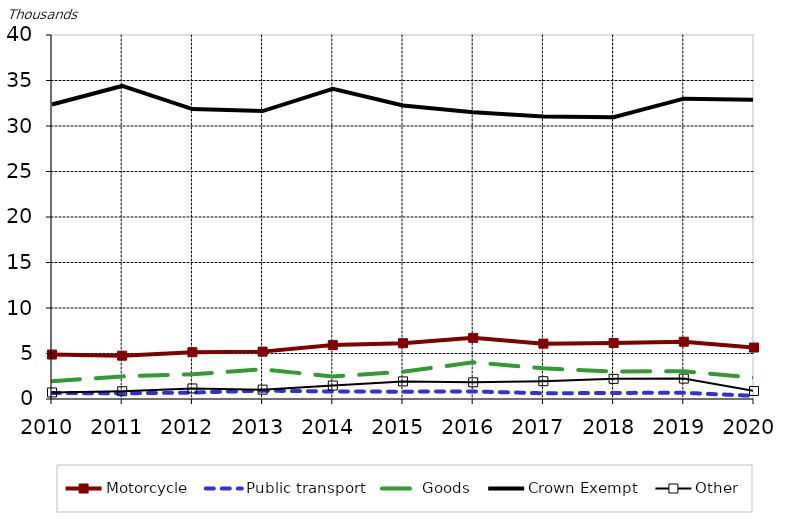
| Category | Motorcycle | Public transport | Goods | Crown Exempt | Other | Crown revised | Other revised |
|---|---|---|---|---|---|---|---|
| 2010 | 4.886 | 0.654 | 1.962 |  |  | 32.357 | 0.72 |
| 2011 | 4.758 | 0.628 | 2.485 |  |  | 34.4 | 0.856 |
| 2012 | 5.139 | 0.704 | 2.72 |  |  | 31.861 | 1.16 |
| 2013 | 5.206 | 0.916 | 3.263 |  |  | 31.64 | 1.027 |
| 2014 | 5.922 | 0.824 | 2.464 |  |  | 34.078 | 1.476 |
| 2015 | 6.13 | 0.806 | 3 |  |  | 32.258 | 1.934 |
| 2016 | 6.721 | 0.83 | 4.025 |  |  | 31.509 | 1.836 |
| 2017 | 6.085 | 0.63 | 3.369 |  |  | 31.054 | 1.957 |
| 2018 | 6.159 | 0.668 | 3.021 |  |  | 30.963 | 2.212 |
| 2019 | 6.293 | 0.686 | 3.057 |  |  | 33.005 | 2.24 |
| 2020 | 5.652 | 0.34 | 2.334 |  |  | 32.876 | 0.883 |